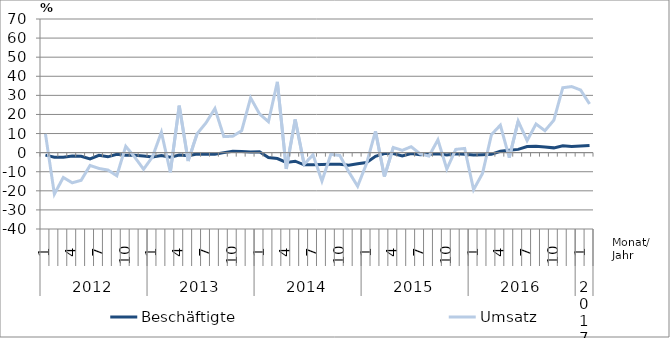
| Category | Beschäftigte | Umsatz |
|---|---|---|
| 0 | -1.3 | 9.8 |
| 1 | -2.4 | -21.7 |
| 2 | -2.4 | -13 |
| 3 | -1.8 | -15.8 |
| 4 | -1.9 | -14.5 |
| 5 | -3.3 | -6.7 |
| 6 | -1.4 | -8.3 |
| 7 | -2.2 | -9.1 |
| 8 | -0.9 | -12.1 |
| 9 | -1.4 | 3.3 |
| 10 | -1.4 | -2.3 |
| 11 | -1.8 | -8.7 |
| 12 | -2.3 | -2.2 |
| 13 | -1.5 | 10.7 |
| 14 | -2.4 | -10.3 |
| 15 | -1.3 | 24.6 |
| 16 | -1.6 | -4.4 |
| 17 | -0.7 | 9.9 |
| 18 | -0.8 | 15.6 |
| 19 | -0.8 | 23.1 |
| 20 | 0 | 8.4 |
| 21 | 0.7 | 8.6 |
| 22 | 0.6 | 11.5 |
| 23 | 0.3 | 28.7 |
| 24 | 0.5 | 20.3 |
| 25 | -2.6 | 16.2 |
| 26 | -3.1 | 37.1 |
| 27 | -5.1 | -8.5 |
| 28 | -4.5 | 17.4 |
| 29 | -6.4 | -6.1 |
| 30 | -6.4 | -1.1 |
| 31 | -6.2 | -14.9 |
| 32 | -6.1 | -0.9 |
| 33 | -6.1 | -1.5 |
| 34 | -6.6 | -10 |
| 35 | -5.8 | -17.6 |
| 36 | -5.2 | -5.7 |
| 37 | -1.9 | 11.2 |
| 38 | -0.5 | -12.5 |
| 39 | -0.5 | 2.7 |
| 40 | -1.7 | 1.2 |
| 41 | -0.5 | 3.1 |
| 42 | -1.1 | -0.6 |
| 43 | -0.8 | -1.8 |
| 44 | -0.6 | 6.7 |
| 45 | -1.2 | -8.6 |
| 46 | -0.6 | 1.7 |
| 47 | -0.9 | 2.2 |
| 48 | -1.3 | -19.4 |
| 49 | -1.1 | -10.9 |
| 50 | -0.8 | 9.4 |
| 51 | 0.7 | 14.4 |
| 52 | 1.2 | -2.6 |
| 53 | 1.7 | 16.5 |
| 54 | 3.2 | 6.3 |
| 55 | 3.4 | 15 |
| 56 | 3 | 11.5 |
| 57 | 2.5 | 17 |
| 58 | 3.6 | 34 |
| 59 | 3.2 | 34.6 |
| 60 | 3.5 | 32.8 |
| 61 | 3.8 | 25.5 |